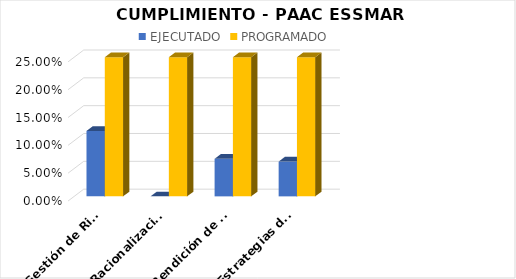
| Category | EJECUTADO | PROGRAMADO |
|---|---|---|
| Gestión de Riesgo | 0.118 | 0.25 |
| Racionalización de Trámites | 0 | 0.25 |
| Rendición de Cuentas | 0.068 | 0.25 |
| Estrategias de Servicio al Ciudadano e implementación de la Ley de Transparencia y Atención al Ciudadano | 0.062 | 0.25 |